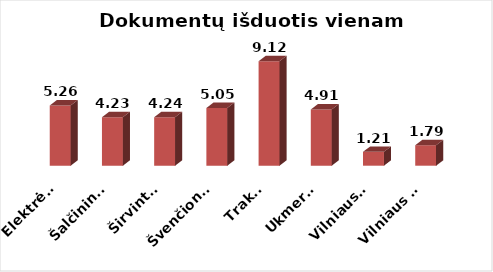
| Category | Series 0 |
|---|---|
|  Elektrėnai | 5.262 |
|  Šalčininkai | 4.233 |
|  Širvintos | 4.242 |
|  Švenčionys | 5.046 |
|  Trakai | 9.122 |
|  Ukmergė | 4.914 |
|  Vilniaus r. | 1.215 |
|  Vilniaus m. | 1.79 |